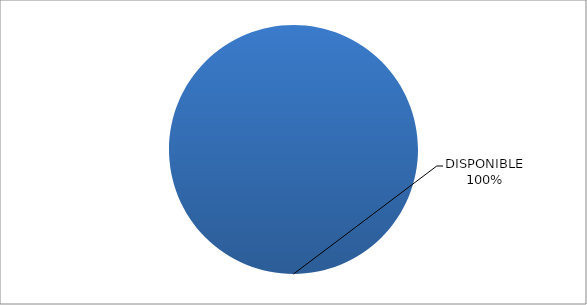
| Category | CÓDIGO DE RED 92 |
|---|---|
| DISPONIBLE | 1 |